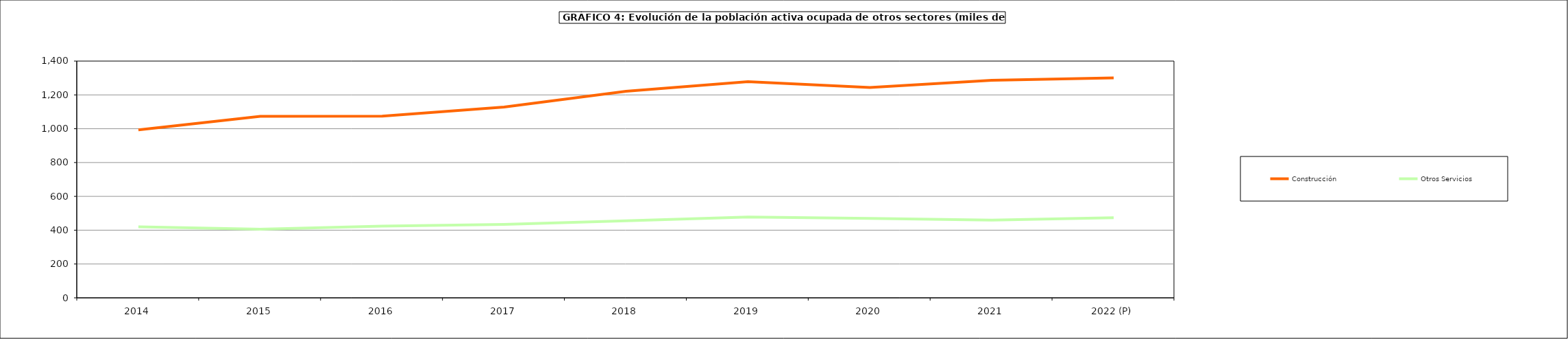
| Category | Construcción | Otros Servicios |
|---|---|---|
| 2014 | 993.5 | 419.6 |
| 2015 | 1073.65 | 405.475 |
| 2016 | 1073.9 | 424.325 |
| 2017 | 1128.3 | 434.6 |
| 2018 | 1221.8 | 455.3 |
| 2019 | 1277.9 | 477.775 |
| 2020 | 1244.075 | 469.65 |
| 2021 | 1285.9 | 459.8 |
| 2022 (P) | 1300.8 | 474 |